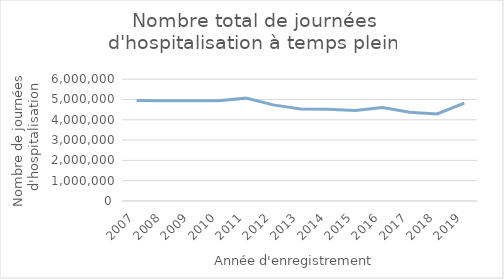
| Category | Nombre total de journées d'hospitalisation |
|---|---|
| 2007.0 | 4943332 |
| 2008.0 | 4936639 |
| 2009.0 | 4931662 |
| 2010.0 | 4930927 |
| 2011.0 | 5065341 |
| 2012.0 | 4733484 |
| 2013.0 | 4531693 |
| 2014.0 | 4519356 |
| 2015.0 | 4460641 |
| 2016.0 | 4604763 |
| 2017.0 | 4366462 |
| 2018.0 | 4287529 |
| 2019.0 | 4816574 |